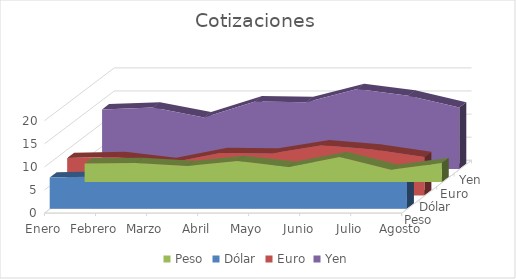
| Category | Peso | Dólar | Euro | Yen |
|---|---|---|---|---|
| Enero | 4.02 | 6.7 | 8.04 | 12.864 |
| Febrero | 4.14 | 6.9 | 8.28 | 13.248 |
| Marzo | 3.48 | 5.8 | 6.96 | 11.136 |
| Abril | 4.56 | 7.6 | 9.12 | 14.592 |
| Mayo | 3.28 | 8.2 | 9.02 | 14.432 |
| Junio | 5.4 | 9 | 10.8 | 17.28 |
| Julio | 2.64 | 6.6 | 9.9 | 15.84 |
| Agosto | 4.14 | 6.9 | 8.28 | 13.248 |